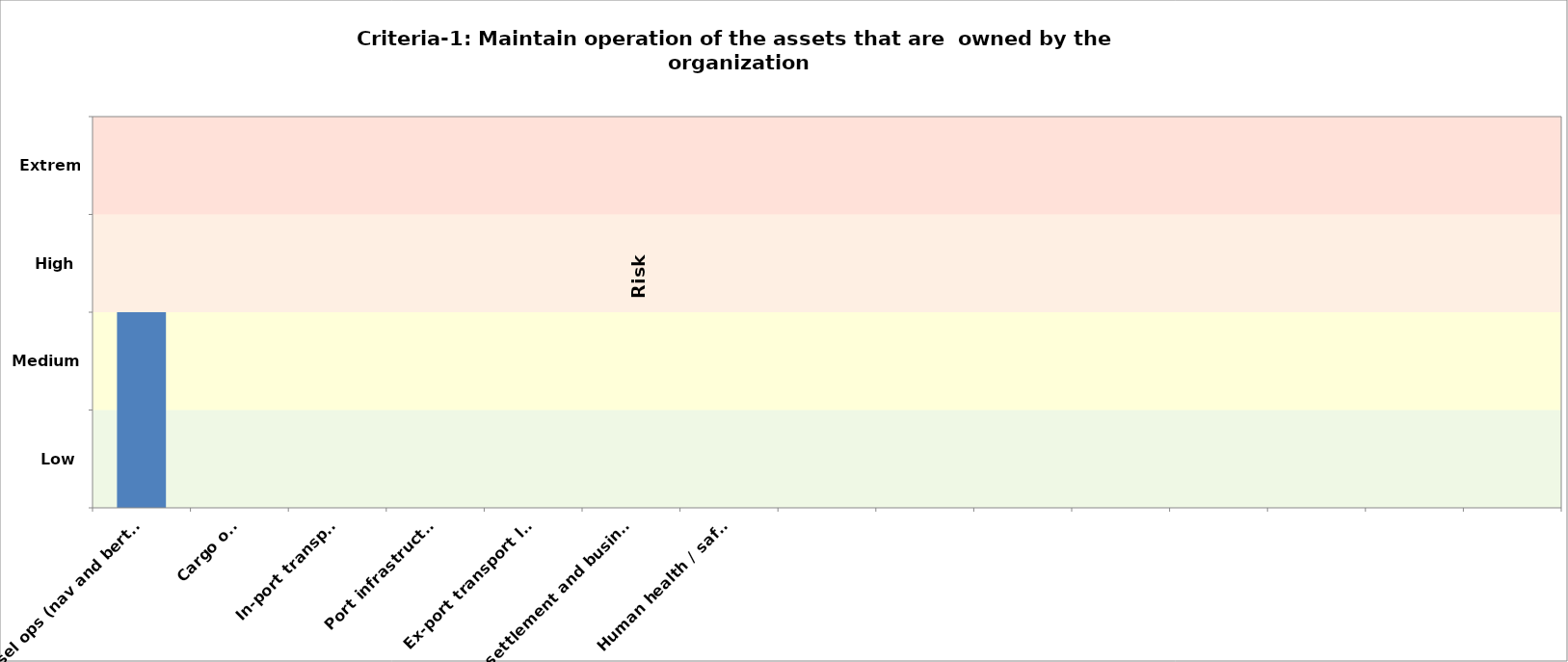
| Category | Criteria-1 2030 |
|---|---|
| Vessel ops (nav and berthing) | 2 |
| Cargo ops | 0 |
| In-port transport | 0 |
| Port infrastructure | 0 |
| Ex-port transport links | 0 |
| Ex-port settlement and businesses | 0 |
| Human health / safety  | 0 |